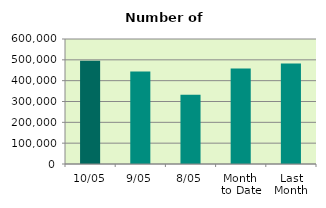
| Category | Series 0 |
|---|---|
| 10/05 | 496052 |
| 9/05 | 443780 |
| 8/05 | 332660 |
| Month 
to Date | 458254.286 |
| Last
Month | 481931.444 |